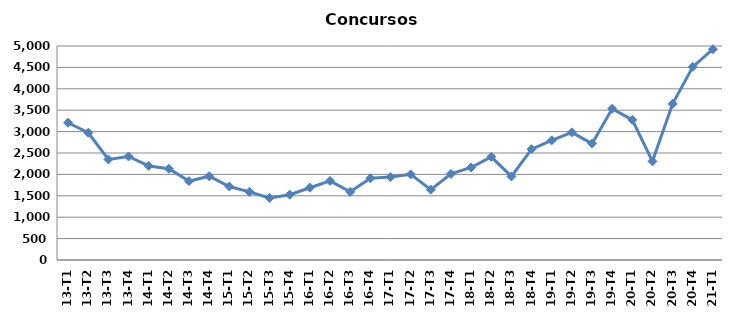
| Category | Concursos |
|---|---|
| 13-T1 | 3207 |
| 13-T2 | 2973 |
| 13-T3 | 2350 |
| 13-T4 | 2419 |
| 14-T1 | 2198 |
| 14-T2 | 2133 |
| 14-T3 | 1843 |
| 14-T4 | 1958 |
| 15-T1 | 1718 |
| 15-T2 | 1593 |
| 15-T3 | 1451 |
| 15-T4 | 1526 |
| 16-T1 | 1689 |
| 16-T2 | 1847 |
| 16-T3 | 1593 |
| 16-T4 | 1911 |
| 17-T1 | 1937 |
| 17-T2 | 2001 |
| 17-T3 | 1645 |
| 17-T4 | 2011 |
| 18-T1 | 2162 |
| 18-T2 | 2410 |
| 18-T3 | 1953 |
| 18-T4 | 2590 |
| 19-T1 | 2796 |
| 19-T2 | 2982 |
| 19-T3 | 2719 |
| 19-T4 | 3534 |
| 20-T1 | 3274 |
| 20-T2 | 2305 |
| 20-T3 | 3649 |
| 20-T4 | 4513 |
| 21-T1 | 4925 |